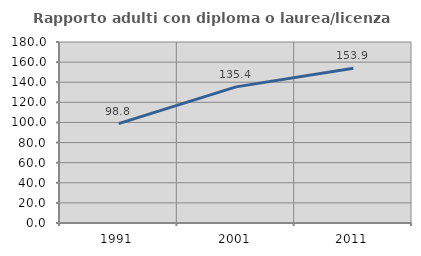
| Category | Rapporto adulti con diploma o laurea/licenza media  |
|---|---|
| 1991.0 | 98.839 |
| 2001.0 | 135.376 |
| 2011.0 | 153.864 |